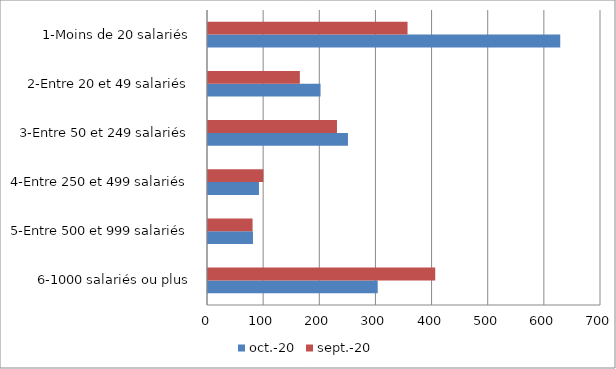
| Category | oct.-20 | sept.-20 |
|---|---|---|
| 6-1000 salariés ou plus | 302.308 | 404.778 |
| 5-Entre 500 et 999 salariés | 80.085 | 79.385 |
| 4-Entre 250 et 499 salariés | 90.772 | 98.55 |
| 3-Entre 50 et 249 salariés | 249.28 | 229.747 |
| 2-Entre 20 et 49 salariés | 200.485 | 163.623 |
| 1-Moins de 20 salariés | 627.408 | 355.454 |